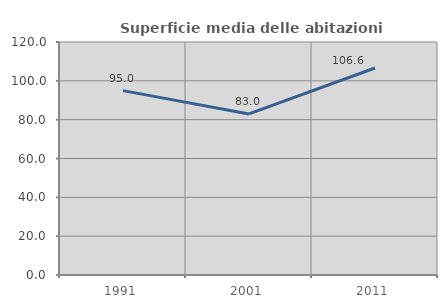
| Category | Superficie media delle abitazioni occupate |
|---|---|
| 1991.0 | 94.964 |
| 2001.0 | 82.959 |
| 2011.0 | 106.595 |